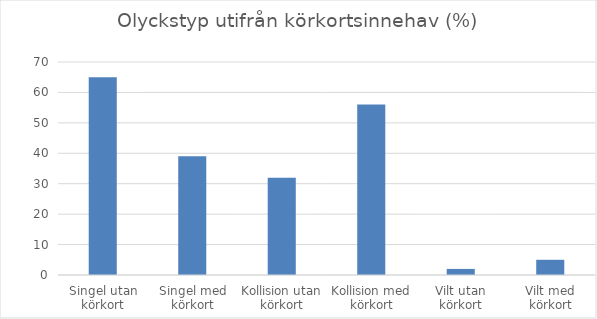
| Category | Andel (%) |
|---|---|
| Singel utan körkort | 65 |
| Singel med körkort | 39 |
| Kollision utan körkort | 32 |
| Kollision med körkort | 56 |
| Vilt utan körkort | 2 |
| Vilt med körkort | 5 |